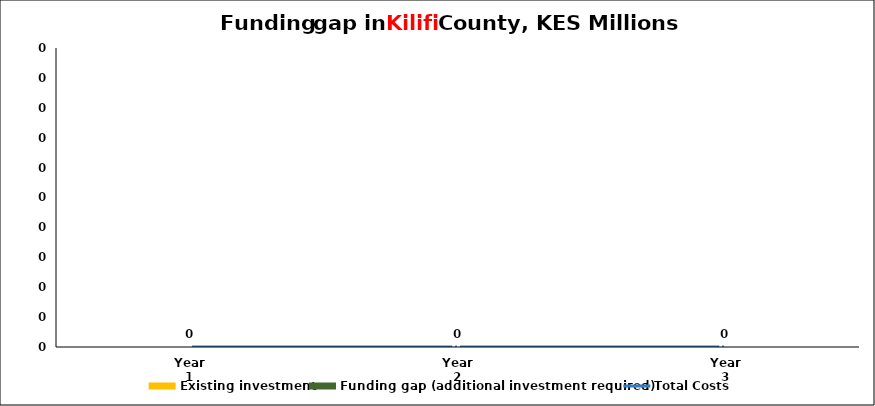
| Category | Existing investment | Funding gap (additional investment required) |
|---|---|---|
| Year 1 | 0 | 0 |
| Year 2 | 0 | 0 |
| Year 3 | 0 | 0 |